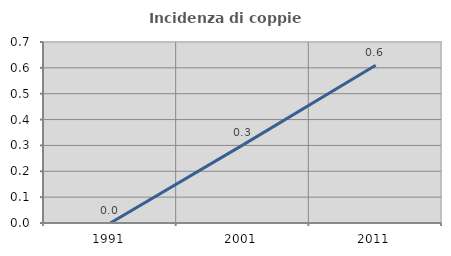
| Category | Incidenza di coppie miste |
|---|---|
| 1991.0 | 0 |
| 2001.0 | 0.302 |
| 2011.0 | 0.61 |